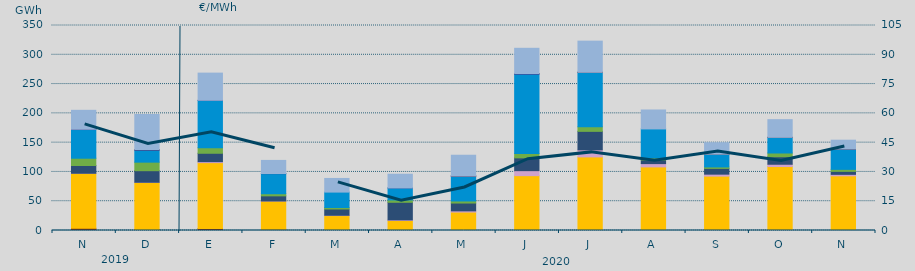
| Category | Carbón | Ciclo Combinado | Cogeneración | Consumo Bombeo | Eólica | Hidráulica | Nuclear | Solar fotovoltaica | Turbinación bombeo |
|---|---|---|---|---|---|---|---|---|---|
| N | 3677.8 | 93991.4 | 51.5 | 13298.4 | 12383 | 48971.8 | 539 | 0 | 32260 |
| D | 1607.3 | 80390.7 | 371.4 | 19733.1 | 14568.3 | 20541.3 | 876.4 | 1.2 | 60128.2 |
| E | 3376.2 | 112471.6 | 1718.3 | 14293.3 | 9539.1 | 80742.1 | 186 | 0 | 46371.3 |
| F | 1995 | 48257.3 | 169 | 8732.4 | 3606.8 | 34283.3 | 267 | 0 | 22347.8 |
| M | 418.1 | 25069.8 | 511.6 | 10680.8 | 2598.7 | 26299.3 | 0 | 0 | 23301.1 |
| A | 0 | 17020 | 1099 | 30032 | 4029 | 20482 | 12 | 0 | 23437 |
| M | 5 | 31454.1 | 2074.9 | 13342 | 3540.5 | 42478.4 | 139 | 1 | 35473.1 |
| J | 105 | 93533.6 | 8541.6 | 21857.1 | 7292.6 | 135598.7 | 1073 | 2 | 43074.4 |
| J | 50 | 125585.6 | 12039 | 31594.3 | 7693.1 | 93034.8 | 70 | 4 | 53243.2 |
| A | 0 | 108564.2 | 5645 | 6241.6 | 3597 | 49376 | 0 | 0 | 32334.2 |
| S | 50 | 92799.2 | 3342.1 | 9830.5 | 2500.3 | 21849.9 | 0 | 1 | 19451 |
| O | 3 | 109185.7 | 3918.6 | 12821.2 | 6372.3 | 26600.6 | 125 | 8 | 30188 |
| N | 213 | 93098.7 | 2563.1 | 5075 | 3418.9 | 34861.3 | 44 | 1 | 14918.7 |